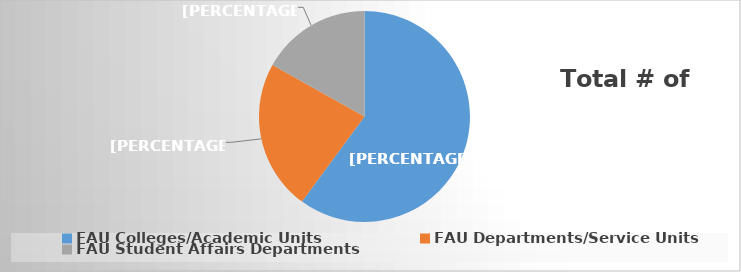
| Category | Series 0 |
|---|---|
| FAU Colleges/Academic Units | 0.601 |
| FAU Departments/Service Units | 0.23 |
| FAU Student Affairs Departments | 0.169 |